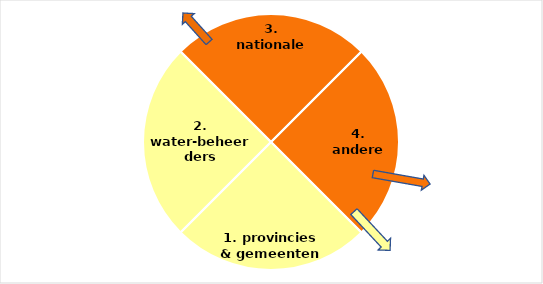
| Category | Series 0 |
|---|---|
| 4. andere sectoren | 1 |
| 1. provincies & gemeenten | 1 |
| 2. water-beheerders | 1 |
| 3. nationale overheid/EU | 1 |